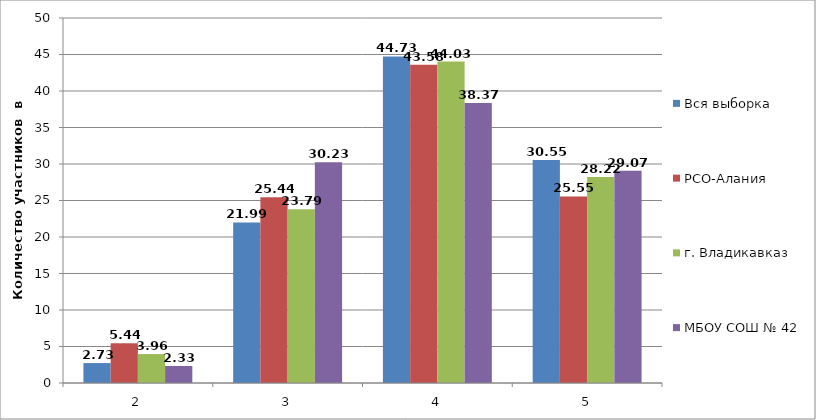
| Category | Вся выборка | РСО-Алания | г. Владикавказ | МБОУ СОШ № 42 |
|---|---|---|---|---|
| 2.0 | 2.73 | 5.44 | 3.96 | 2.33 |
| 3.0 | 21.99 | 25.44 | 23.79 | 30.23 |
| 4.0 | 44.73 | 43.58 | 44.03 | 38.37 |
| 5.0 | 30.55 | 25.55 | 28.22 | 29.07 |